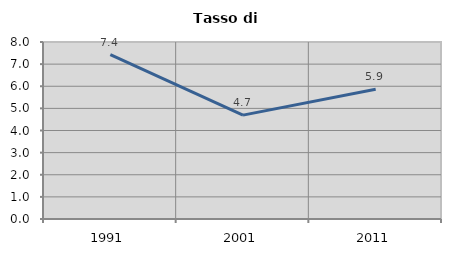
| Category | Tasso di disoccupazione   |
|---|---|
| 1991.0 | 7.432 |
| 2001.0 | 4.696 |
| 2011.0 | 5.864 |